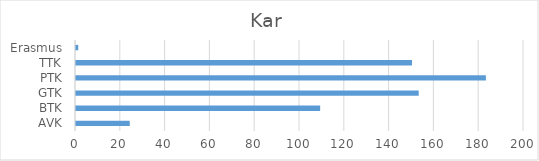
| Category | Series 0 |
|---|---|
| AVK | 24 |
| BTK | 109 |
| GTK | 153 |
| PTK | 183 |
| TTK | 150 |
| Erasmus | 1 |